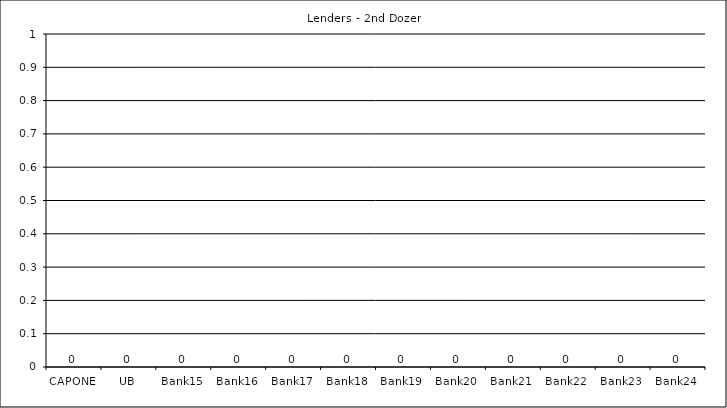
| Category | Lenders - 2nd Dozen |
|---|---|
| CAPONE | 0 |
| UB | 0 |
| Bank15 | 0 |
| Bank16 | 0 |
| Bank17 | 0 |
| Bank18 | 0 |
| Bank19 | 0 |
| Bank20 | 0 |
| Bank21 | 0 |
| Bank22 | 0 |
| Bank23 | 0 |
| Bank24 | 0 |